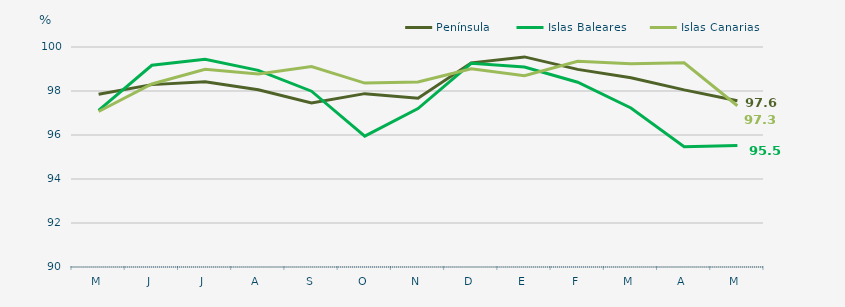
| Category | Península | Islas Baleares | Islas Canarias |
|---|---|---|---|
| M | 97.85 | 97.12 | 97.07 |
| J | 98.29 | 99.17 | 98.32 |
| J | 98.42 | 99.44 | 98.99 |
| A | 98.06 | 98.94 | 98.77 |
| S | 97.46 | 97.99 | 99.11 |
| O | 97.88 | 95.95 | 98.36 |
| N | 97.67 | 97.2 | 98.41 |
| D | 99.28 | 99.26 | 99.01 |
| E | 99.55 | 99.09 | 98.69 |
| F | 98.984 | 98.4 | 99.35 |
| M | 98.6 | 97.23 | 99.24 |
| A | 98.05 | 95.47 | 99.28 |
| M | 97.56 | 95.52 | 97.33 |